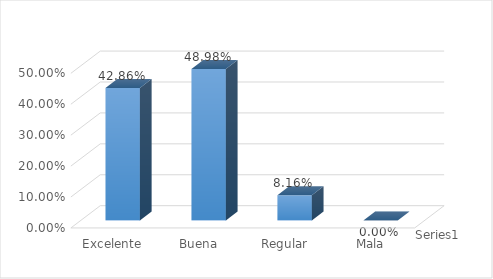
| Category | Series 0 |
|---|---|
| Excelente | 0.429 |
| Buena | 0.49 |
| Regular | 0.082 |
| Mala | 0 |